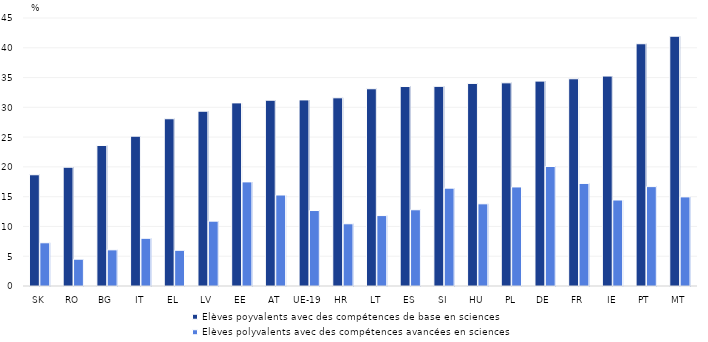
| Category | Elèves poyvalents avec des compétences de base en sciences | Elèves polyvalents avec des compétences avancées en sciences |
|---|---|---|
| SK | 18.68 | 7.259 |
| RO | 19.945 | 4.501 |
| BG | 23.596 | 6.07 |
| IT | 25.156 | 8.01 |
| EL | 28.082 | 5.995 |
| LV | 29.35 | 10.887 |
| EE | 30.748 | 17.482 |
| AT | 31.195 | 15.279 |
| UE-19 | 31.247 | 12.674 |
| HR | 31.601 | 10.449 |
| LT | 33.12 | 11.826 |
| ES | 33.493 | 12.799 |
| SI | 33.524 | 16.433 |
| HU | 34.014 | 13.798 |
| PL | 34.113 | 16.633 |
| DE | 34.402 | 20.065 |
| FR | 34.797 | 17.221 |
| IE | 35.253 | 14.439 |
| PT | 40.676 | 16.687 |
| MT | 41.942 | 14.965 |